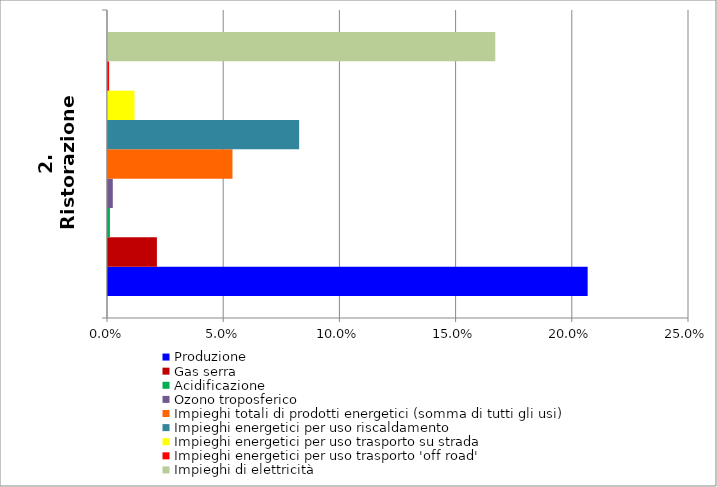
| Category | Produzione | Gas serra | Acidificazione | Ozono troposferico | Impieghi totali di prodotti energetici (somma di tutti gli usi) | Impieghi energetici per uso riscaldamento | Impieghi energetici per uso trasporto su strada | Impieghi energetici per uso trasporto 'off road' | Impieghi di elettricità |
|---|---|---|---|---|---|---|---|---|---|
| 2. Ristorazione | 0.206 | 0.021 | 0.001 | 0.002 | 0.054 | 0.082 | 0.011 | 0 | 0.167 |